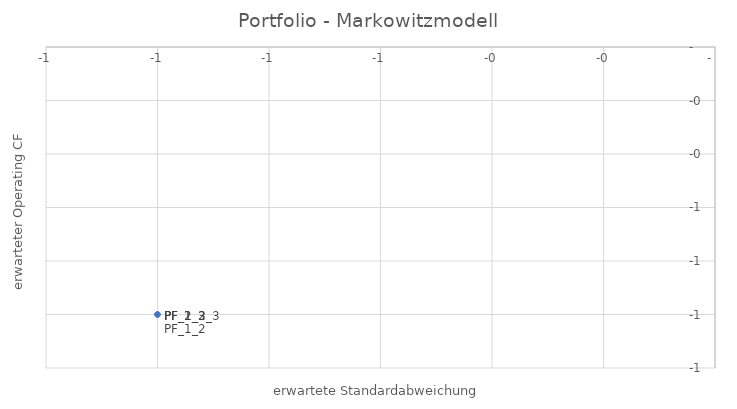
| Category | Portfolio |
|---|---|
| -1.0 | -1 |
| -1.0 | -1 |
| -1.0 | -1 |
| -1.0 | -1 |